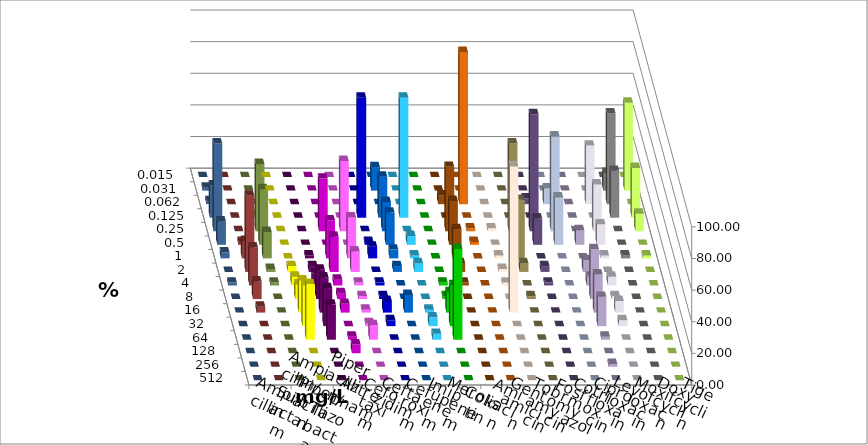
| Category | Ampicillin | Ampicillin/ Sulbactam | Piperacillin | Piperacillin/ Tazobactam | Aztreonam | Cefotaxim | Ceftazidim | Cefuroxim | Imipenem | Meropenem | Colistin | Amikacin | Gentamicin | Tobramycin | Fosfomycin | Cotrimoxazol | Ciprofloxacin | Levofloxacin | Moxifloxacin | Doxycyclin | Tigecyclin |
|---|---|---|---|---|---|---|---|---|---|---|---|---|---|---|---|---|---|---|---|---|---|
| 0.015 | 0 | 0 | 0 | 0 | 0 | 0 | 0 | 0 | 0 | 0 | 0 | 0 | 0 | 0 | 0 | 0 | 0 | 0 | 0 | 0 | 0 |
| 0.031 | 0 | 0 | 0 | 0 | 0 | 14.815 | 0 | 0 | 0 | 0 | 0 | 0 | 0 | 0 | 0 | 0 | 11.111 | 55.556 | 1.852 | 0 | 0 |
| 0.062 | 0 | 0 | 0 | 0 | 0 | 0 | 0 | 0 | 5.556 | 96.296 | 0 | 0 | 3.704 | 10 | 0 | 37.037 | 57.407 | 0 | 1.852 | 0 | 0 |
| 0.125 | 0 | 0 | 0 | 0 | 75.926 | 25.926 | 75.926 | 0 | 0 | 0 | 0 | 0 | 0 | 0 | 0 | 0 | 29.63 | 31.481 | 20.37 | 0 | 1.852 |
| 0.25 | 0 | 0 | 33.333 | 44.444 | 0 | 18.519 | 0 | 0 | 40.741 | 1.852 | 1.852 | 55.556 | 74.074 | 60 | 0 | 29.63 | 0 | 11.111 | 55.556 | 0 | 42.593 |
| 0.5 | 0 | 0 | 0 | 0 | 1.852 | 20.37 | 5.556 | 0 | 27.778 | 1.852 | 0 | 0 | 16.667 | 30 | 9.259 | 12.963 | 0 | 0 | 14.815 | 1.852 | 35.185 |
| 1.0 | 0 | 1.852 | 24.074 | 25.926 | 7.407 | 5.556 | 1.852 | 0 | 18.519 | 0 | 1.852 | 37.037 | 0 | 0 | 0 | 1.852 | 1.852 | 1.852 | 3.704 | 11.111 | 16.667 |
| 2.0 | 3.704 | 3.704 | 22.222 | 12.963 | 0 | 3.704 | 5.556 | 0 | 5.556 | 0 | 1.852 | 5.556 | 3.704 | 0 | 7.407 | 0 | 0 | 0 | 0 | 48.148 | 1.852 |
| 4.0 | 5.556 | 7.407 | 3.704 | 1.852 | 1.852 | 0 | 0 | 1.852 | 1.852 | 0 | 1.852 | 0 | 1.852 | 0 | 5.556 | 5.556 | 0 | 0 | 1.852 | 24.074 | 1.852 |
| 8.0 | 9.259 | 18.519 | 3.704 | 1.852 | 1.852 | 0 | 0 | 1.852 | 0 | 0 | 0 | 1.852 | 0 | 0 | 31.481 | 1.852 | 0 | 0 | 0 | 11.111 | 0 |
| 16.0 | 20.37 | 22.222 | 5.556 | 1.852 | 7.407 | 11.111 | 1.852 | 12.963 | 0 | 0 | 92.593 | 0 | 0 | 0 | 24.074 | 7.407 | 0 | 0 | 0 | 3.704 | 0 |
| 32.0 | 25.926 | 24.074 | 0 | 1.852 | 3.704 | 0 | 5.556 | 25.926 | 0 | 0 | 0 | 0 | 0 | 0 | 18.519 | 3.704 | 0 | 0 | 0 | 0 | 0 |
| 64.0 | 35.185 | 22.222 | 1.852 | 9.259 | 0 | 0 | 3.704 | 57.407 | 0 | 0 | 0 | 0 | 0 | 0 | 1.852 | 0 | 0 | 0 | 0 | 0 | 0 |
| 128.0 | 0 | 0 | 5.556 | 0 | 0 | 0 | 0 | 0 | 0 | 0 | 0 | 0 | 0 | 0 | 0 | 0 | 0 | 0 | 0 | 0 | 0 |
| 256.0 | 0 | 0 | 0 | 0 | 0 | 0 | 0 | 0 | 0 | 0 | 0 | 0 | 0 | 0 | 1.852 | 0 | 0 | 0 | 0 | 0 | 0 |
| 512.0 | 0 | 0 | 0 | 0 | 0 | 0 | 0 | 0 | 0 | 0 | 0 | 0 | 0 | 0 | 0 | 0 | 0 | 0 | 0 | 0 | 0 |